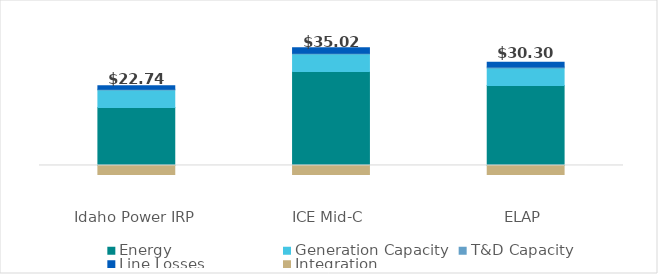
| Category | Energy | Generation Capacity | T&D Capacity | Line Losses | Integration |
|---|---|---|---|---|---|
| 0 | 18.651 | 5.629 | 0.307 | 1.082 | -2.93 |
| 1 | 30.257 | 5.629 | 0.307 | 1.755 | -2.93 |
| 2 | 25.796 | 5.629 | 0.307 | 1.496 | -2.93 |